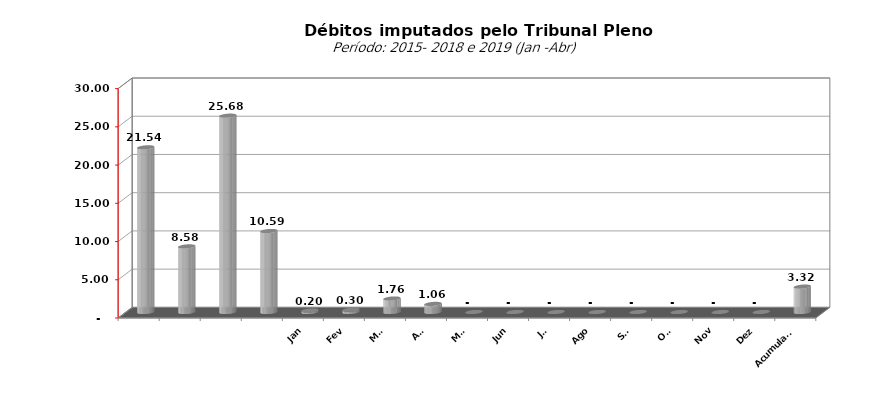
| Category |  7.073.154,74   5.749.129,25   4.727.033,51   16.081.820,48   21.535.723,60   8.578.266,09   25.676.499,17   10.592.915,18   197.255,77   296.375,09   1.764.671,00   1.058.511,33   -     -     -     -     -     -     -     -     3.316.813,19  |
|---|---|
|  | 21535723.6 |
|  | 8578266.09 |
|  | 25676499.17 |
|  | 10592915.18 |
| Jan | 197255.77 |
| Fev | 296375.09 |
| Mar | 1764671 |
| Abr | 1058511.33 |
| Mai | 0 |
| Jun | 0 |
| Jul | 0 |
| Ago | 0 |
| Set | 0 |
| Out | 0 |
| Nov | 0 |
| Dez | 0 |
| Acumulado | 3316813.19 |